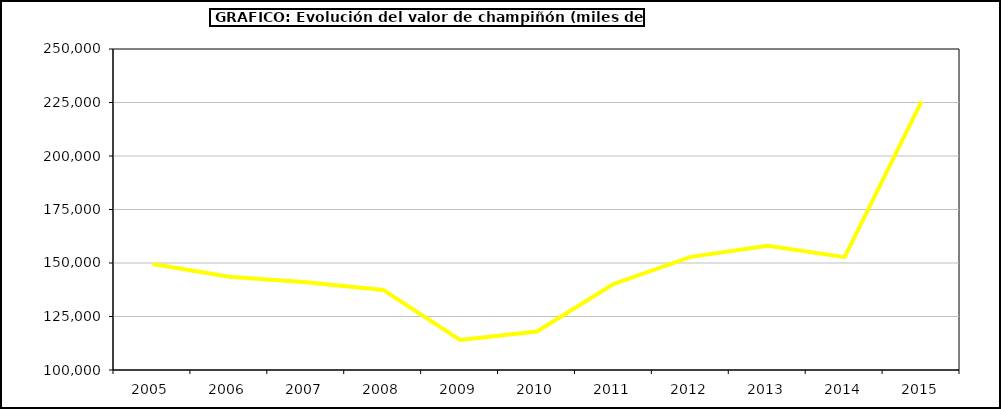
| Category | Valor |
|---|---|
| 2005.0 | 149500.718 |
| 2006.0 | 143535.505 |
| 2007.0 | 141006.375 |
| 2008.0 | 137424.559 |
| 2009.0 | 114028.006 |
| 2010.0 | 117998.554 |
| 2011.0 | 140234.857 |
| 2012.0 | 152884.195 |
| 2013.0 | 158028.957 |
| 2014.0 | 152745.292 |
| 2015.0 | 225505 |